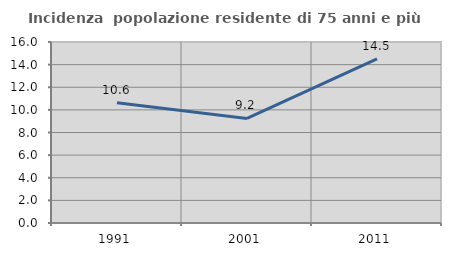
| Category | Incidenza  popolazione residente di 75 anni e più |
|---|---|
| 1991.0 | 10.638 |
| 2001.0 | 9.244 |
| 2011.0 | 14.5 |